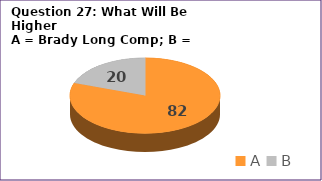
| Category | Series 0 |
|---|---|
| A | 82 |
| B | 20 |